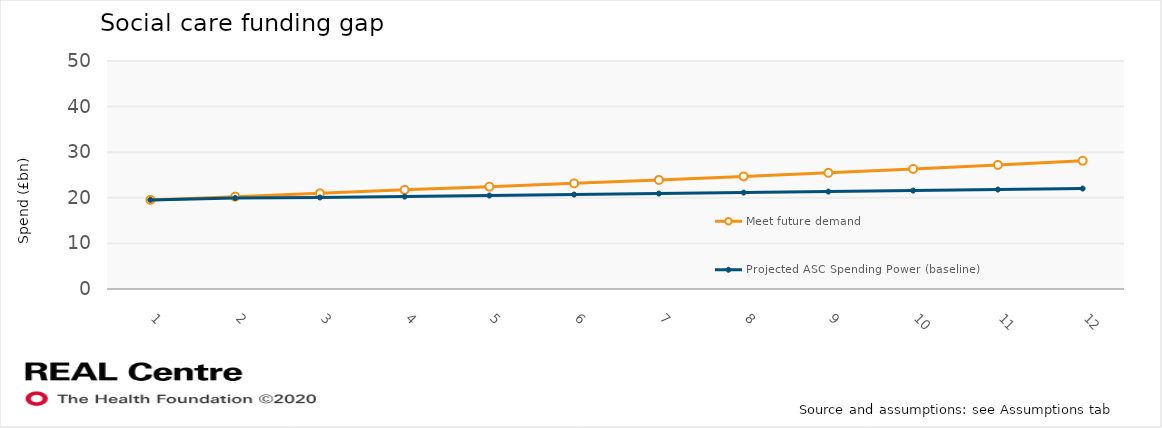
| Category | Meet future demand | Projected ASC Spending Power (baseline) |
|---|---|---|
| 0 | 19.543 | 19.543 |
| 1 | 20.25 | 19.963 |
| 2 | 20.983 | 20.077 |
| 3 | 21.742 | 20.264 |
| 4 | 22.444 | 20.496 |
| 5 | 23.168 | 20.708 |
| 6 | 23.915 | 20.923 |
| 7 | 24.687 | 21.14 |
| 8 | 25.484 | 21.359 |
| 9 | 26.335 | 21.58 |
| 10 | 27.215 | 21.804 |
| 11 | 28.124 | 22.03 |